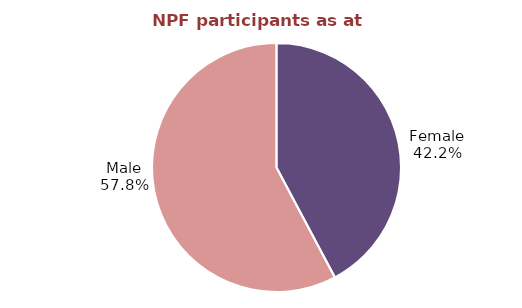
| Category | Series 0 |
|---|---|
| Female | 370307 |
| Male | 506705 |